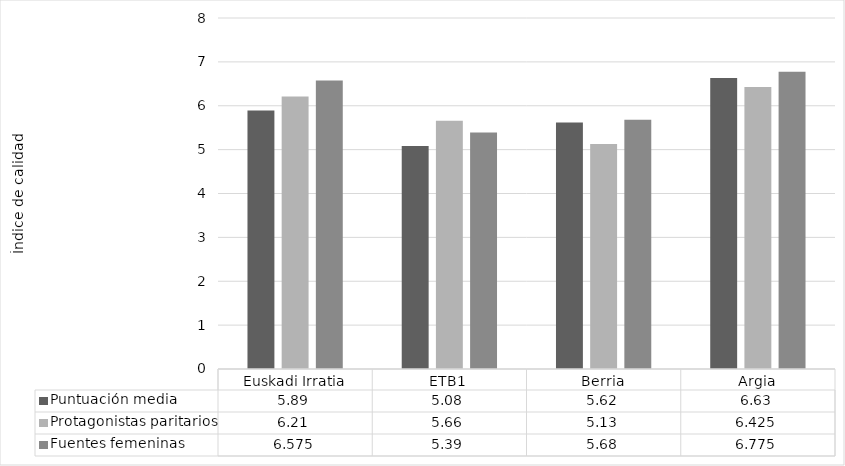
| Category | Puntuación media | Protagonistas paritarios | Fuentes femeninas |
|---|---|---|---|
| Euskadi Irratia | 5.89 | 6.21 | 6.575 |
| ETB1 | 5.08 | 5.66 | 5.39 |
| Berria | 5.62 | 5.13 | 5.68 |
| Argia | 6.63 | 6.425 | 6.775 |